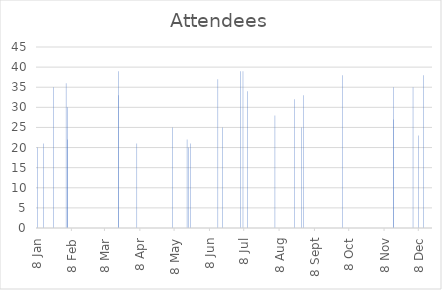
| Category | Series 0 |
|---|---|
| 2016-01-08 | 20 |
| 2016-01-13 | 21 |
| 2016-01-22 | 35 |
| 2016-02-02 | 36 |
| 2016-02-03 | 22 |
| 2016-02-03 | 30 |
| 2016-03-19 | 33 |
| 2016-03-19 | 39 |
| 2016-04-04 | 21 |
| 2016-05-05 | 25 |
| 2016-05-18 | 22 |
| 2016-05-19 | 20 |
| 2016-05-21 | 21 |
| 2016-06-14 | 37 |
| 2016-06-18 | 25 |
| 2016-07-04 | 39 |
| 2016-07-06 | 39 |
| 2016-07-10 | 34 |
| 2016-08-03 | 28 |
| 2016-08-20 | 32 |
| 2016-08-26 | 25 |
| 2016-08-28 | 33 |
| 2016-10-01 | 38 |
| 2016-11-15 | 35 |
| 2016-11-15 | 27 |
| 2016-12-02 | 35 |
| 2016-12-07 | 23 |
| 2016-12-11 | 38 |
| 2016-12-19 | 20 |